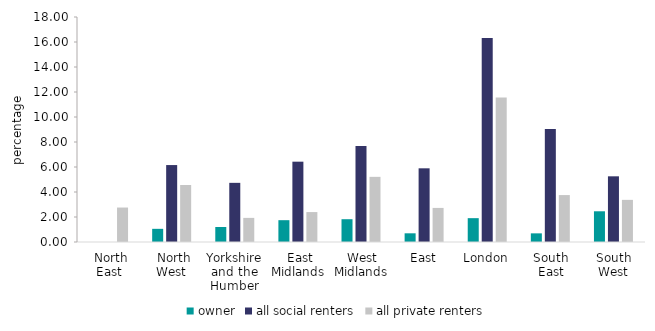
| Category | owner | all social renters | all private renters |
|---|---|---|---|
|  North East | 0 | 0 | 2.757 |
|  North West | 1.053 | 6.155 | 4.562 |
| Yorkshire and the Humber | 1.2 | 4.733 | 1.929 |
|  East Midlands | 1.745 | 6.426 | 2.394 |
|  West Midlands | 1.823 | 7.673 | 5.212 |
| East | 0.695 | 5.895 | 2.727 |
| London | 1.907 | 16.329 | 11.566 |
| South East | 0.692 | 9.042 | 3.754 |
| South West | 2.457 | 5.255 | 3.37 |